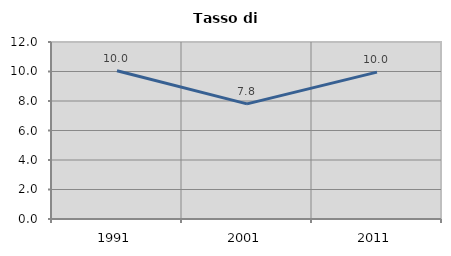
| Category | Tasso di disoccupazione   |
|---|---|
| 1991.0 | 10.048 |
| 2001.0 | 7.805 |
| 2011.0 | 9.957 |